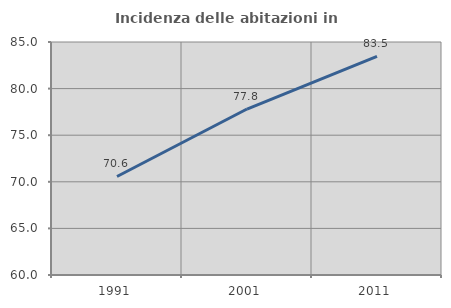
| Category | Incidenza delle abitazioni in proprietà  |
|---|---|
| 1991.0 | 70.571 |
| 2001.0 | 77.808 |
| 2011.0 | 83.46 |